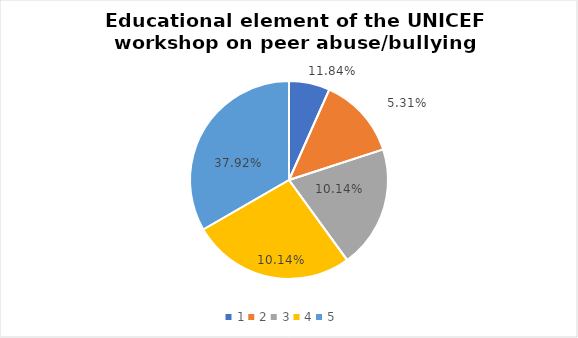
| Category | Series 0 | Series 1 |
|---|---|---|
| 0 | 1 | 0.118 |
| 1 | 2 | 0.053 |
| 2 | 3 | 0.101 |
| 3 | 4 | 0.101 |
| 4 | 5 | 0.379 |